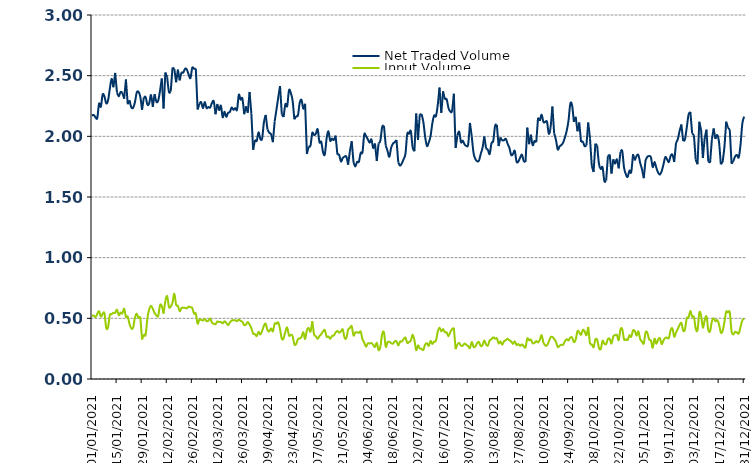
| Category | Net Traded Volume | Input Volume |
|---|---|---|
| 01/01/2021 | 2.17 | 0.52 |
| 02/01/2021 | 2.176 | 0.523 |
| 03/01/2021 | 2.157 | 0.51 |
| 04/01/2021 | 2.151 | 0.537 |
| 05/01/2021 | 2.27 | 0.559 |
| 06/01/2021 | 2.244 | 0.515 |
| 07/01/2021 | 2.345 | 0.538 |
| 08/01/2021 | 2.329 | 0.541 |
| 09/01/2021 | 2.272 | 0.422 |
| 10/01/2021 | 2.296 | 0.426 |
| 11/01/2021 | 2.391 | 0.525 |
| 12/01/2021 | 2.474 | 0.534 |
| 13/01/2021 | 2.404 | 0.546 |
| 14/01/2021 | 2.523 | 0.545 |
| 15/01/2021 | 2.361 | 0.572 |
| 16/01/2021 | 2.329 | 0.526 |
| 17/01/2021 | 2.365 | 0.548 |
| 18/01/2021 | 2.355 | 0.541 |
| 19/01/2021 | 2.31 | 0.58 |
| 20/01/2021 | 2.468 | 0.512 |
| 21/01/2021 | 2.265 | 0.514 |
| 22/01/2021 | 2.297 | 0.453 |
| 23/01/2021 | 2.239 | 0.417 |
| 24/01/2021 | 2.235 | 0.423 |
| 25/01/2021 | 2.279 | 0.506 |
| 26/01/2021 | 2.36 | 0.539 |
| 27/01/2021 | 2.367 | 0.503 |
| 28/01/2021 | 2.327 | 0.515 |
| 29/01/2021 | 2.218 | 0.326 |
| 30/01/2021 | 2.322 | 0.368 |
| 31/01/2021 | 2.323 | 0.366 |
| 01/02/2021 | 2.261 | 0.504 |
| 02/02/2021 | 2.273 | 0.574 |
| 03/02/2021 | 2.34 | 0.603 |
| 04/02/2021 | 2.243 | 0.579 |
| 05/02/2021 | 2.348 | 0.544 |
| 06/02/2021 | 2.285 | 0.525 |
| 07/02/2021 | 2.295 | 0.52 |
| 08/02/2021 | 2.374 | 0.608 |
| 09/02/2021 | 2.477 | 0.602 |
| 10/02/2021 | 2.229 | 0.538 |
| 11/02/2021 | 2.526 | 0.645 |
| 12/02/2021 | 2.487 | 0.684 |
| 13/02/2021 | 2.367 | 0.593 |
| 14/02/2021 | 2.371 | 0.597 |
| 15/02/2021 | 2.566 | 0.631 |
| 16/02/2021 | 2.556 | 0.702 |
| 17/02/2021 | 2.446 | 0.612 |
| 18/02/2021 | 2.55 | 0.603 |
| 19/02/2021 | 2.461 | 0.559 |
| 20/02/2021 | 2.523 | 0.585 |
| 21/02/2021 | 2.525 | 0.588 |
| 22/02/2021 | 2.557 | 0.586 |
| 23/02/2021 | 2.55 | 0.582 |
| 24/02/2021 | 2.509 | 0.597 |
| 25/02/2021 | 2.48 | 0.592 |
| 26/02/2021 | 2.564 | 0.585 |
| 27/02/2021 | 2.557 | 0.539 |
| 28/02/2021 | 2.558 | 0.54 |
| 01/03/2021 | 2.221 | 0.456 |
| 02/03/2021 | 2.269 | 0.491 |
| 03/03/2021 | 2.282 | 0.487 |
| 04/03/2021 | 2.232 | 0.482 |
| 05/03/2021 | 2.283 | 0.495 |
| 06/03/2021 | 2.233 | 0.477 |
| 07/03/2021 | 2.241 | 0.48 |
| 08/03/2021 | 2.237 | 0.498 |
| 09/03/2021 | 2.275 | 0.465 |
| 10/03/2021 | 2.288 | 0.455 |
| 11/03/2021 | 2.182 | 0.452 |
| 12/03/2021 | 2.267 | 0.474 |
| 13/03/2021 | 2.217 | 0.47 |
| 14/03/2021 | 2.253 | 0.47 |
| 15/03/2021 | 2.157 | 0.459 |
| 16/03/2021 | 2.204 | 0.475 |
| 17/03/2021 | 2.161 | 0.464 |
| 18/03/2021 | 2.194 | 0.444 |
| 19/03/2021 | 2.2 | 0.465 |
| 20/03/2021 | 2.237 | 0.482 |
| 21/03/2021 | 2.219 | 0.484 |
| 22/03/2021 | 2.233 | 0.484 |
| 23/03/2021 | 2.219 | 0.477 |
| 24/03/2021 | 2.342 | 0.49 |
| 25/03/2021 | 2.303 | 0.478 |
| 26/03/2021 | 2.311 | 0.471 |
| 27/03/2021 | 2.182 | 0.444 |
| 28/03/2021 | 2.247 | 0.449 |
| 29/03/2021 | 2.194 | 0.469 |
| 30/03/2021 | 2.366 | 0.449 |
| 31/03/2021 | 2.186 | 0.419 |
| 01/04/2021 | 1.889 | 0.373 |
| 02/04/2021 | 1.97 | 0.37 |
| 03/04/2021 | 1.963 | 0.354 |
| 04/04/2021 | 2.033 | 0.389 |
| 05/04/2021 | 1.979 | 0.366 |
| 06/04/2021 | 1.982 | 0.396 |
| 07/04/2021 | 2.115 | 0.438 |
| 08/04/2021 | 2.176 | 0.455 |
| 09/04/2021 | 2.056 | 0.403 |
| 10/04/2021 | 2.029 | 0.393 |
| 11/04/2021 | 2.017 | 0.417 |
| 12/04/2021 | 1.952 | 0.393 |
| 13/04/2021 | 2.122 | 0.457 |
| 14/04/2021 | 2.22 | 0.455 |
| 15/04/2021 | 2.32 | 0.466 |
| 16/04/2021 | 2.415 | 0.411 |
| 17/04/2021 | 2.18 | 0.332 |
| 18/04/2021 | 2.159 | 0.334 |
| 19/04/2021 | 2.265 | 0.391 |
| 20/04/2021 | 2.25 | 0.424 |
| 21/04/2021 | 2.379 | 0.358 |
| 22/04/2021 | 2.358 | 0.365 |
| 23/04/2021 | 2.295 | 0.355 |
| 24/04/2021 | 2.14 | 0.287 |
| 25/04/2021 | 2.167 | 0.287 |
| 26/04/2021 | 2.174 | 0.329 |
| 27/04/2021 | 2.277 | 0.334 |
| 28/04/2021 | 2.3 | 0.347 |
| 29/04/2021 | 2.228 | 0.386 |
| 30/04/2021 | 2.268 | 0.329 |
| 01/05/2021 | 1.855 | 0.402 |
| 02/05/2021 | 1.916 | 0.42 |
| 03/05/2021 | 1.924 | 0.391 |
| 04/05/2021 | 2.027 | 0.476 |
| 05/05/2021 | 2.01 | 0.362 |
| 06/05/2021 | 2.022 | 0.352 |
| 07/05/2021 | 2.058 | 0.331 |
| 08/05/2021 | 1.952 | 0.354 |
| 09/05/2021 | 1.955 | 0.37 |
| 10/05/2021 | 1.869 | 0.391 |
| 11/05/2021 | 1.852 | 0.403 |
| 12/05/2021 | 1.983 | 0.349 |
| 13/05/2021 | 2.041 | 0.351 |
| 14/05/2021 | 1.963 | 0.331 |
| 15/05/2021 | 1.981 | 0.354 |
| 16/05/2021 | 1.97 | 0.358 |
| 17/05/2021 | 2.006 | 0.382 |
| 18/05/2021 | 1.851 | 0.396 |
| 19/05/2021 | 1.847 | 0.382 |
| 20/05/2021 | 1.793 | 0.393 |
| 21/05/2021 | 1.821 | 0.409 |
| 22/05/2021 | 1.833 | 0.341 |
| 23/05/2021 | 1.833 | 0.337 |
| 24/05/2021 | 1.766 | 0.406 |
| 25/05/2021 | 1.878 | 0.42 |
| 26/05/2021 | 1.96 | 0.435 |
| 27/05/2021 | 1.788 | 0.359 |
| 28/05/2021 | 1.751 | 0.382 |
| 29/05/2021 | 1.789 | 0.385 |
| 30/05/2021 | 1.79 | 0.38 |
| 31/05/2021 | 1.863 | 0.391 |
| 01/06/2021 | 1.868 | 0.329 |
| 02/06/2021 | 2.016 | 0.299 |
| 03/06/2021 | 2.002 | 0.266 |
| 04/06/2021 | 1.975 | 0.294 |
| 05/06/2021 | 1.947 | 0.293 |
| 06/06/2021 | 1.975 | 0.297 |
| 07/06/2021 | 1.903 | 0.281 |
| 08/06/2021 | 1.941 | 0.264 |
| 09/06/2021 | 1.797 | 0.298 |
| 10/06/2021 | 1.942 | 0.238 |
| 11/06/2021 | 1.965 | 0.267 |
| 12/06/2021 | 2.076 | 0.37 |
| 13/06/2021 | 2.087 | 0.383 |
| 14/06/2021 | 1.924 | 0.266 |
| 15/06/2021 | 1.88 | 0.303 |
| 16/06/2021 | 1.831 | 0.307 |
| 17/06/2021 | 1.905 | 0.295 |
| 18/06/2021 | 1.939 | 0.291 |
| 19/06/2021 | 1.952 | 0.31 |
| 20/06/2021 | 1.97 | 0.311 |
| 21/06/2021 | 1.784 | 0.275 |
| 22/06/2021 | 1.758 | 0.309 |
| 23/06/2021 | 1.778 | 0.31 |
| 24/06/2021 | 1.813 | 0.329 |
| 25/06/2021 | 1.856 | 0.341 |
| 26/06/2021 | 2.021 | 0.298 |
| 27/06/2021 | 2.022 | 0.304 |
| 28/06/2021 | 2.043 | 0.318 |
| 29/06/2021 | 1.91 | 0.365 |
| 30/06/2021 | 1.877 | 0.32 |
| 01/07/2021 | 2.188 | 0.238 |
| 02/07/2021 | 1.969 | 0.277 |
| 03/07/2021 | 2.182 | 0.252 |
| 04/07/2021 | 2.183 | 0.248 |
| 05/07/2021 | 2.117 | 0.24 |
| 06/07/2021 | 1.995 | 0.284 |
| 07/07/2021 | 1.92 | 0.294 |
| 08/07/2021 | 1.95 | 0.273 |
| 09/07/2021 | 2.001 | 0.314 |
| 10/07/2021 | 2.107 | 0.289 |
| 11/07/2021 | 2.172 | 0.308 |
| 12/07/2021 | 2.166 | 0.315 |
| 13/07/2021 | 2.256 | 0.389 |
| 14/07/2021 | 2.402 | 0.423 |
| 15/07/2021 | 2.193 | 0.393 |
| 16/07/2021 | 2.371 | 0.411 |
| 17/07/2021 | 2.304 | 0.385 |
| 18/07/2021 | 2.306 | 0.384 |
| 19/07/2021 | 2.234 | 0.352 |
| 20/07/2021 | 2.205 | 0.385 |
| 21/07/2021 | 2.211 | 0.41 |
| 22/07/2021 | 2.351 | 0.422 |
| 23/07/2021 | 1.904 | 0.246 |
| 24/07/2021 | 2.007 | 0.288 |
| 25/07/2021 | 2.037 | 0.298 |
| 26/07/2021 | 1.951 | 0.274 |
| 27/07/2021 | 1.963 | 0.275 |
| 28/07/2021 | 1.933 | 0.292 |
| 29/07/2021 | 1.921 | 0.282 |
| 30/07/2021 | 1.935 | 0.27 |
| 31/07/2021 | 2.111 | 0.255 |
| 01/08/2021 | 1.999 | 0.305 |
| 02/08/2021 | 1.863 | 0.264 |
| 03/08/2021 | 1.814 | 0.268 |
| 04/08/2021 | 1.795 | 0.296 |
| 05/08/2021 | 1.799 | 0.305 |
| 06/08/2021 | 1.855 | 0.272 |
| 07/08/2021 | 1.905 | 0.28 |
| 08/08/2021 | 1.999 | 0.318 |
| 09/08/2021 | 1.9 | 0.285 |
| 10/08/2021 | 1.889 | 0.276 |
| 11/08/2021 | 1.854 | 0.318 |
| 12/08/2021 | 1.944 | 0.328 |
| 13/08/2021 | 1.962 | 0.343 |
| 14/08/2021 | 2.085 | 0.332 |
| 15/08/2021 | 2.096 | 0.336 |
| 16/08/2021 | 1.92 | 0.294 |
| 17/08/2021 | 1.991 | 0.31 |
| 18/08/2021 | 1.967 | 0.283 |
| 19/08/2021 | 1.968 | 0.31 |
| 20/08/2021 | 1.979 | 0.32 |
| 21/08/2021 | 1.939 | 0.332 |
| 22/08/2021 | 1.906 | 0.318 |
| 23/08/2021 | 1.847 | 0.311 |
| 24/08/2021 | 1.854 | 0.289 |
| 25/08/2021 | 1.881 | 0.311 |
| 26/08/2021 | 1.792 | 0.28 |
| 27/08/2021 | 1.793 | 0.288 |
| 28/08/2021 | 1.824 | 0.273 |
| 29/08/2021 | 1.849 | 0.285 |
| 30/08/2021 | 1.797 | 0.27 |
| 31/08/2021 | 1.788 | 0.261 |
| 01/09/2021 | 2.072 | 0.334 |
| 02/09/2021 | 1.935 | 0.319 |
| 03/09/2021 | 2.014 | 0.325 |
| 04/09/2021 | 1.928 | 0.295 |
| 05/09/2021 | 1.961 | 0.297 |
| 06/09/2021 | 1.951 | 0.313 |
| 07/09/2021 | 2.153 | 0.301 |
| 08/09/2021 | 2.128 | 0.322 |
| 09/09/2021 | 2.179 | 0.361 |
| 10/09/2021 | 2.118 | 0.301 |
| 11/09/2021 | 2.119 | 0.277 |
| 12/09/2021 | 2.12 | 0.277 |
| 13/09/2021 | 2.022 | 0.308 |
| 14/09/2021 | 2.077 | 0.344 |
| 15/09/2021 | 2.245 | 0.347 |
| 16/09/2021 | 2.024 | 0.33 |
| 17/09/2021 | 1.971 | 0.306 |
| 18/09/2021 | 1.892 | 0.263 |
| 19/09/2021 | 1.916 | 0.274 |
| 20/09/2021 | 1.928 | 0.282 |
| 21/09/2021 | 1.948 | 0.282 |
| 22/09/2021 | 1.992 | 0.312 |
| 23/09/2021 | 2.046 | 0.329 |
| 24/09/2021 | 2.13 | 0.318 |
| 25/09/2021 | 2.268 | 0.342 |
| 26/09/2021 | 2.255 | 0.341 |
| 27/09/2021 | 2.119 | 0.304 |
| 28/09/2021 | 2.161 | 0.324 |
| 29/09/2021 | 2.042 | 0.394 |
| 30/09/2021 | 2.114 | 0.384 |
| 01/10/2021 | 1.954 | 0.364 |
| 02/10/2021 | 1.955 | 0.405 |
| 03/10/2021 | 1.919 | 0.392 |
| 04/10/2021 | 1.925 | 0.361 |
| 05/10/2021 | 2.114 | 0.429 |
| 06/10/2021 | 1.981 | 0.287 |
| 07/10/2021 | 1.754 | 0.284 |
| 08/10/2021 | 1.706 | 0.263 |
| 09/10/2021 | 1.94 | 0.326 |
| 10/10/2021 | 1.923 | 0.323 |
| 11/10/2021 | 1.773 | 0.257 |
| 12/10/2021 | 1.731 | 0.247 |
| 13/10/2021 | 1.745 | 0.315 |
| 14/10/2021 | 1.632 | 0.291 |
| 15/10/2021 | 1.635 | 0.288 |
| 16/10/2021 | 1.837 | 0.33 |
| 17/10/2021 | 1.85 | 0.33 |
| 18/10/2021 | 1.693 | 0.293 |
| 19/10/2021 | 1.811 | 0.352 |
| 20/10/2021 | 1.774 | 0.361 |
| 21/10/2021 | 1.81 | 0.363 |
| 22/10/2021 | 1.736 | 0.32 |
| 23/10/2021 | 1.871 | 0.409 |
| 24/10/2021 | 1.878 | 0.411 |
| 25/10/2021 | 1.742 | 0.326 |
| 26/10/2021 | 1.687 | 0.328 |
| 27/10/2021 | 1.665 | 0.322 |
| 28/10/2021 | 1.717 | 0.361 |
| 29/10/2021 | 1.705 | 0.347 |
| 30/10/2021 | 1.853 | 0.4 |
| 31/10/2021 | 1.802 | 0.395 |
| 01/11/2021 | 1.839 | 0.356 |
| 02/11/2021 | 1.845 | 0.392 |
| 03/11/2021 | 1.78 | 0.329 |
| 04/11/2021 | 1.729 | 0.308 |
| 05/11/2021 | 1.655 | 0.293 |
| 06/11/2021 | 1.805 | 0.383 |
| 07/11/2021 | 1.831 | 0.381 |
| 08/11/2021 | 1.837 | 0.327 |
| 09/11/2021 | 1.827 | 0.317 |
| 10/11/2021 | 1.747 | 0.257 |
| 11/11/2021 | 1.789 | 0.332 |
| 12/11/2021 | 1.742 | 0.29 |
| 13/11/2021 | 1.701 | 0.323 |
| 14/11/2021 | 1.685 | 0.337 |
| 15/11/2021 | 1.713 | 0.287 |
| 16/11/2021 | 1.769 | 0.318 |
| 17/11/2021 | 1.829 | 0.338 |
| 18/11/2021 | 1.81 | 0.341 |
| 19/11/2021 | 1.788 | 0.338 |
| 20/11/2021 | 1.839 | 0.403 |
| 21/11/2021 | 1.848 | 0.416 |
| 22/11/2021 | 1.788 | 0.348 |
| 23/11/2021 | 1.946 | 0.383 |
| 24/11/2021 | 1.977 | 0.412 |
| 25/11/2021 | 2.044 | 0.446 |
| 26/11/2021 | 2.098 | 0.461 |
| 27/11/2021 | 1.961 | 0.398 |
| 28/11/2021 | 1.975 | 0.409 |
| 29/11/2021 | 2.073 | 0.5 |
| 30/11/2021 | 2.179 | 0.507 |
| 01/12/2021 | 2.202 | 0.56 |
| 02/12/2021 | 2.025 | 0.513 |
| 03/12/2021 | 2.008 | 0.511 |
| 04/12/2021 | 1.806 | 0.415 |
| 05/12/2021 | 1.77 | 0.404 |
| 06/12/2021 | 2.12 | 0.547 |
| 07/12/2021 | 2.053 | 0.523 |
| 08/12/2021 | 1.821 | 0.424 |
| 09/12/2021 | 1.986 | 0.484 |
| 10/12/2021 | 2.055 | 0.515 |
| 11/12/2021 | 1.793 | 0.407 |
| 12/12/2021 | 1.783 | 0.393 |
| 13/12/2021 | 1.972 | 0.474 |
| 14/12/2021 | 2.065 | 0.5 |
| 15/12/2021 | 1.978 | 0.476 |
| 16/12/2021 | 2.01 | 0.485 |
| 17/12/2021 | 1.953 | 0.451 |
| 18/12/2021 | 1.77 | 0.383 |
| 19/12/2021 | 1.788 | 0.396 |
| 20/12/2021 | 1.911 | 0.469 |
| 21/12/2021 | 2.121 | 0.555 |
| 22/12/2021 | 2.072 | 0.548 |
| 23/12/2021 | 2.054 | 0.549 |
| 24/12/2021 | 1.774 | 0.393 |
| 25/12/2021 | 1.796 | 0.367 |
| 26/12/2021 | 1.835 | 0.388 |
| 27/12/2021 | 1.846 | 0.383 |
| 28/12/2021 | 1.827 | 0.375 |
| 29/12/2021 | 1.929 | 0.428 |
| 30/12/2021 | 2.104 | 0.482 |
| 31/12/2021 | 2.163 | 0.498 |